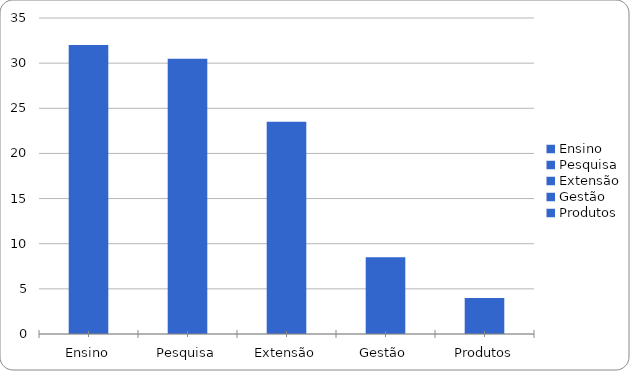
| Category | Series 0 |
|---|---|
| Ensino | 32 |
| Pesquisa | 30.5 |
| Extensão | 23.5 |
| Gestão | 8.5 |
| Produtos | 4 |